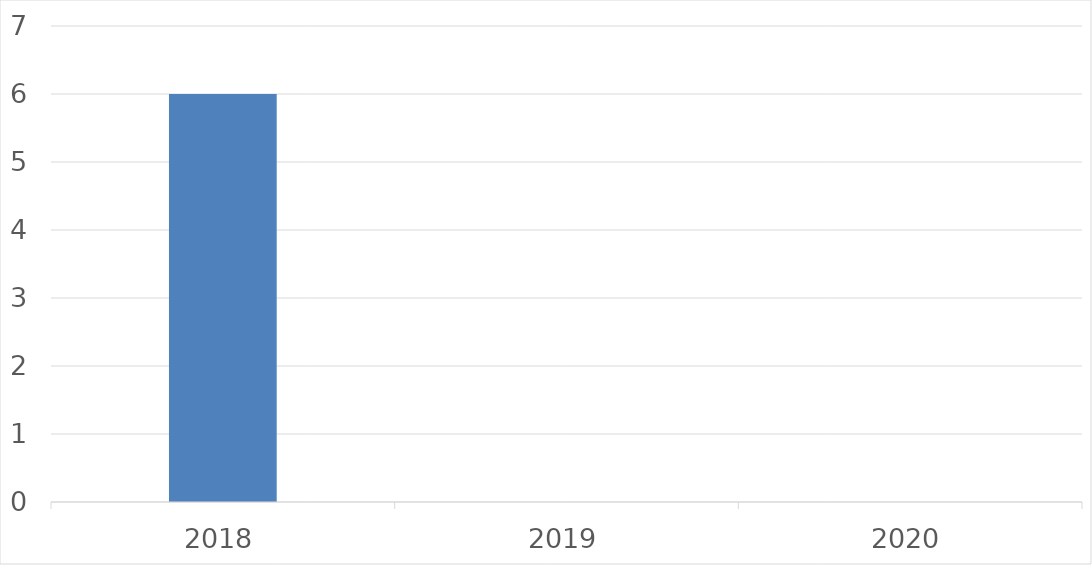
| Category | Series 0 |
|---|---|
| 2018 | 6 |
| 2019 | 0 |
| 2020 | 0 |